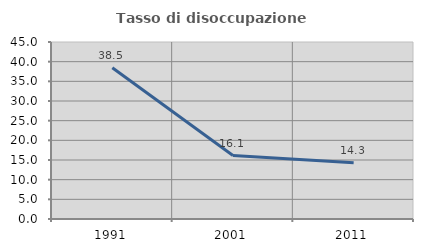
| Category | Tasso di disoccupazione giovanile  |
|---|---|
| 1991.0 | 38.462 |
| 2001.0 | 16.129 |
| 2011.0 | 14.286 |